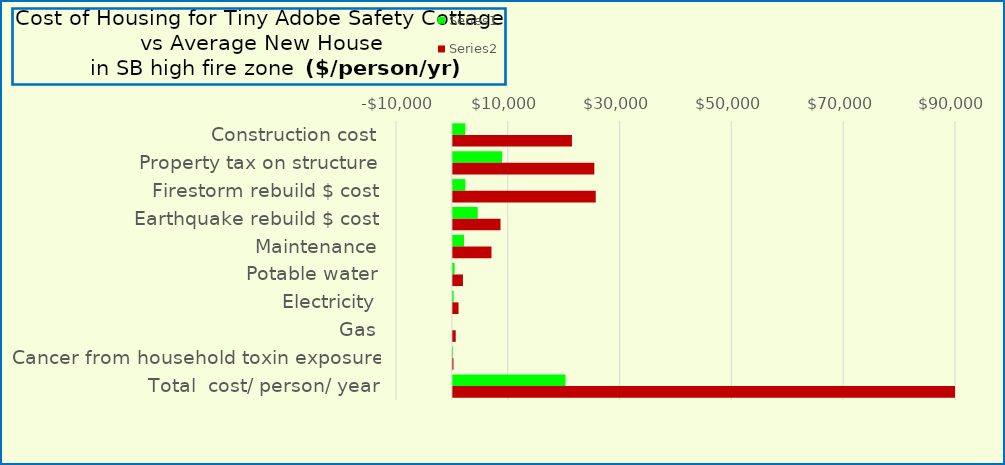
| Category | Series 0 | Series 1 |
|---|---|---|
| Construction cost | 2222.222 | 21296.296 |
| Property tax on structure | 8800 | 25300 |
| Firestorm rebuild $ cost | 2222.222 | 25555.556 |
| Earthquake rebuild $ cost | 4444.444 | 8518.519 |
| Maintenance | 2000 | 6900 |
| Potable water | 300 | 1800 |
| Electricity | 144 | 1008 |
| Gas | 0 | 504 |
| Cancer from household toxin exposure | 15 | 100 |
| Total  cost/ person/ year | 20147.889 | 90982.37 |